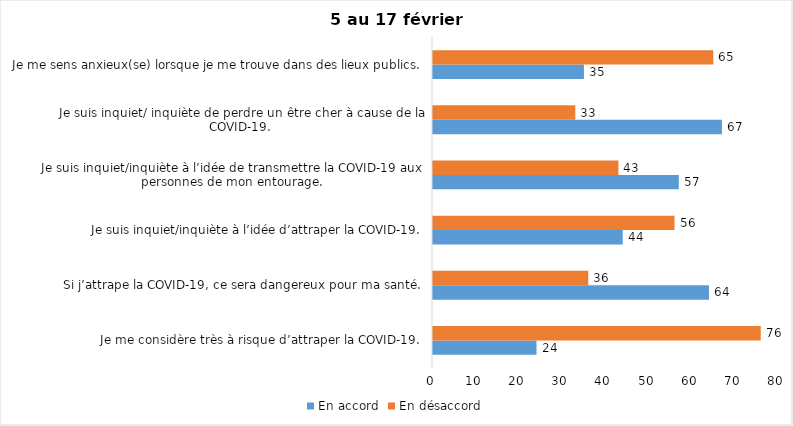
| Category | En accord | En désaccord |
|---|---|---|
| Je me considère très à risque d’attraper la COVID-19. | 24 | 76 |
| Si j’attrape la COVID-19, ce sera dangereux pour ma santé. | 64 | 36 |
| Je suis inquiet/inquiète à l’idée d’attraper la COVID-19. | 44 | 56 |
| Je suis inquiet/inquiète à l’idée de transmettre la COVID-19 aux personnes de mon entourage. | 57 | 43 |
| Je suis inquiet/ inquiète de perdre un être cher à cause de la COVID-19. | 67 | 33 |
| Je me sens anxieux(se) lorsque je me trouve dans des lieux publics. | 35 | 65 |